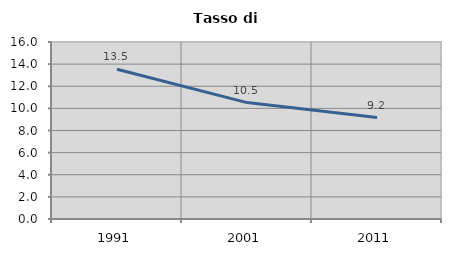
| Category | Tasso di disoccupazione   |
|---|---|
| 1991.0 | 13.53 |
| 2001.0 | 10.521 |
| 2011.0 | 9.174 |